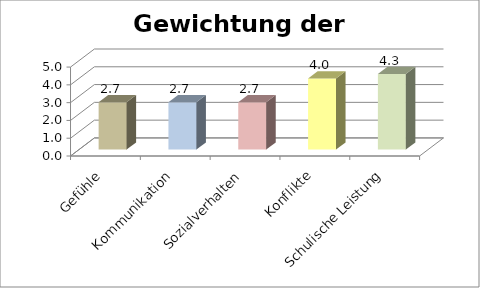
| Category | Series 0 |
|---|---|
| Gefühle | 2.667 |
| Kommunikation | 2.667 |
| Sozialverhalten | 2.667 |
| Konflikte | 4 |
| Schulische Leistung | 4.25 |